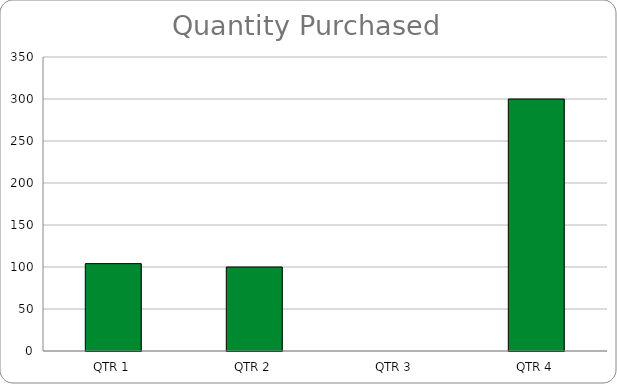
| Category | Quantity Purchases |
|---|---|
| QTR 1 | 104 |
| QTR 2 | 100 |
| QTR 3 | 0 |
| QTR 4 | 300 |